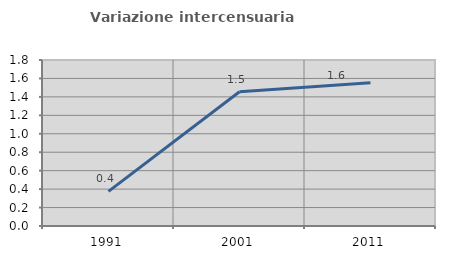
| Category | Variazione intercensuaria annua |
|---|---|
| 1991.0 | 0.376 |
| 2001.0 | 1.456 |
| 2011.0 | 1.554 |